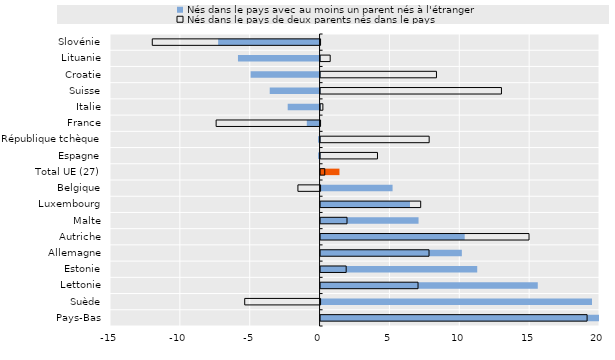
| Category | Nés dans le pays avec au moins un parent nés à l'étranger | Nés dans le pays de deux parents nés dans le pays |
|---|---|---|
| Slovénie | -7.26 | -12.01 |
| Lituanie | -5.841 | 0.688 |
| Croatie | -4.935 | 8.294 |
| Suisse | -3.568 | 12.946 |
| Italie | -2.281 | 0.165 |
| France | -0.913 | -7.44 |
| République tchèque | -0.109 | 7.773 |
| Espagne | -0.109 | 4.072 |
| Total UE (27) | 1.351 | 0.301 |
| Belgique | 5.154 | -1.586 |
| Luxembourg | 6.4 | 7.167 |
| Malte | 7.012 | 1.892 |
| Autriche | 10.315 | 14.92 |
| Allemagne | 10.112 | 7.763 |
| Estonie | 11.212 | 1.831 |
| Lettonie | 15.546 | 6.975 |
| Suède | 19.427 | -5.394 |
| Pays-Bas | 35.337 | 19.076 |